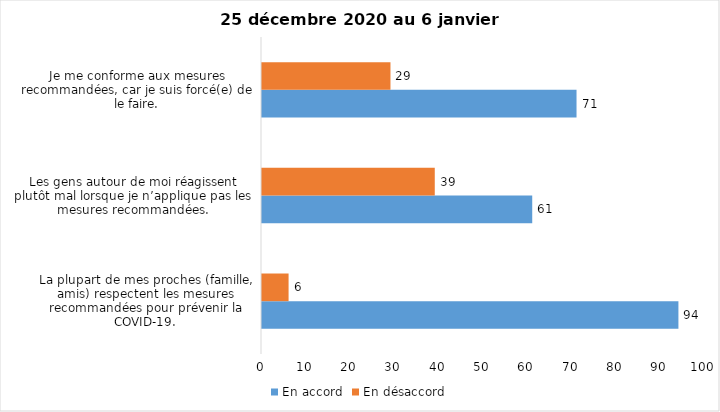
| Category | En accord | En désaccord |
|---|---|---|
| La plupart de mes proches (famille, amis) respectent les mesures recommandées pour prévenir la COVID-19. | 94 | 6 |
| Les gens autour de moi réagissent plutôt mal lorsque je n’applique pas les mesures recommandées. | 61 | 39 |
| Je me conforme aux mesures recommandées, car je suis forcé(e) de le faire. | 71 | 29 |